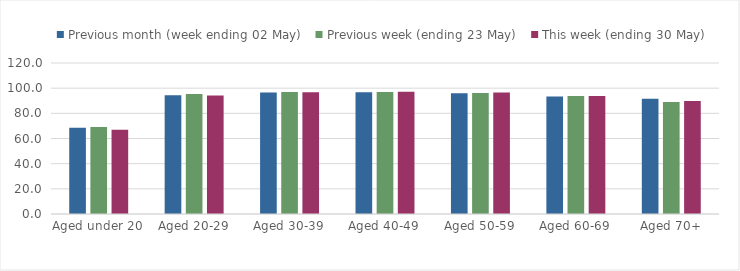
| Category | Previous month (week ending 02 May) | Previous week (ending 23 May) | This week (ending 30 May) |
|---|---|---|---|
| Aged under 20 | 68.611 | 69.171 | 66.99 |
| Aged 20-29 | 94.433 | 95.277 | 94.261 |
| Aged 30-39 | 96.593 | 96.915 | 96.828 |
| Aged 40-49 | 96.657 | 96.859 | 97.237 |
| Aged 50-59 | 95.924 | 96.195 | 96.605 |
| Aged 60-69 | 93.284 | 93.858 | 93.783 |
| Aged 70+ | 91.601 | 89.093 | 89.73 |